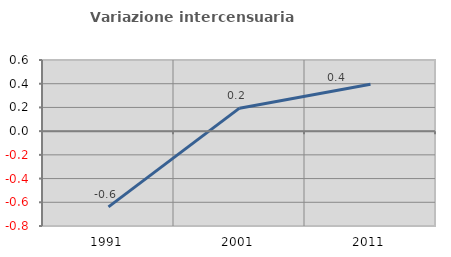
| Category | Variazione intercensuaria annua |
|---|---|
| 1991.0 | -0.639 |
| 2001.0 | 0.194 |
| 2011.0 | 0.395 |